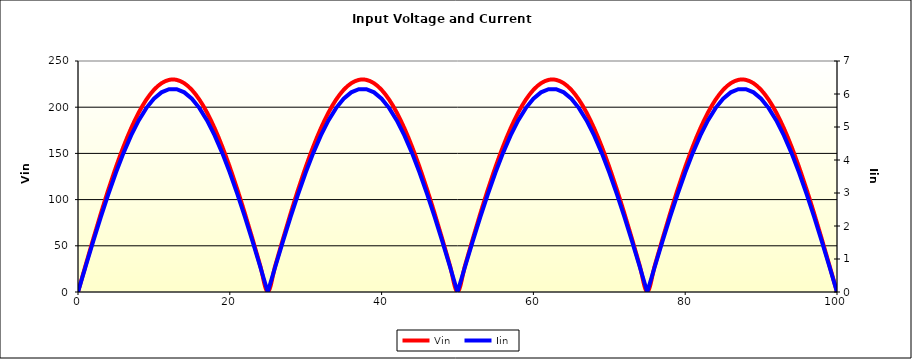
| Category | Vin |
|---|---|
| 0.0 | 0 |
| 0.1 | 2.89 |
| 0.2 | 5.78 |
| 0.3 | 8.669 |
| 0.4 | 11.556 |
| 0.5 | 14.442 |
| 0.6 | 17.325 |
| 0.7 | 20.206 |
| 0.8 | 23.083 |
| 0.9 | 25.957 |
| 1.0 | 28.827 |
| 2.0 | 57.199 |
| 3.0 | 84.669 |
| 4.0 | 110.803 |
| 5.0 | 135.191 |
| 6.0 | 157.446 |
| 7.0 | 177.218 |
| 8.0 | 194.195 |
| 9.0 | 208.11 |
| 10.0 | 218.743 |
| 11.0 | 225.926 |
| 12.0 | 229.546 |
| 13.0 | 229.546 |
| 14.0 | 225.926 |
| 15.0 | 218.743 |
| 16.0 | 208.11 |
| 17.0 | 194.195 |
| 18.0 | 177.218 |
| 19.0 | 157.446 |
| 20.0 | 135.191 |
| 21.0 | 110.803 |
| 22.0 | 84.669 |
| 23.0 | 57.199 |
| 24.0 | 28.827 |
| 25.0 | 0 |
| 26.0 | 28.827 |
| 27.0 | 57.199 |
| 28.0 | 84.669 |
| 29.0 | 110.803 |
| 30.0 | 135.191 |
| 31.0 | 157.446 |
| 32.0 | 177.218 |
| 33.0 | 194.195 |
| 34.0 | 208.11 |
| 35.0 | 218.743 |
| 36.0 | 225.926 |
| 37.0 | 229.546 |
| 38.0 | 229.546 |
| 39.0 | 225.926 |
| 40.0 | 218.743 |
| 41.0 | 208.11 |
| 42.0 | 194.195 |
| 43.0 | 177.218 |
| 44.0 | 157.446 |
| 45.0 | 135.191 |
| 46.0 | 110.803 |
| 47.0 | 84.669 |
| 48.0 | 57.199 |
| 49.0 | 28.827 |
| 50.0 | 0 |
| 51.0 | 28.827 |
| 52.0 | 57.199 |
| 53.0 | 84.669 |
| 54.0 | 110.803 |
| 55.0 | 135.191 |
| 56.0 | 157.446 |
| 57.0 | 177.218 |
| 58.0 | 194.195 |
| 59.0 | 208.11 |
| 60.0 | 218.743 |
| 61.0 | 225.926 |
| 62.0 | 229.546 |
| 63.0 | 229.546 |
| 64.0 | 225.926 |
| 65.0 | 218.743 |
| 66.0 | 208.11 |
| 67.0 | 194.195 |
| 68.0 | 177.218 |
| 69.0 | 157.446 |
| 70.0 | 135.191 |
| 71.0 | 110.803 |
| 72.0 | 84.669 |
| 73.0 | 57.199 |
| 74.0 | 28.827 |
| 75.0 | 0 |
| 76.0 | 28.827 |
| 77.0 | 57.199 |
| 78.0 | 84.669 |
| 79.0 | 110.803 |
| 80.0 | 135.191 |
| 81.0 | 157.446 |
| 82.0 | 177.218 |
| 83.0 | 194.195 |
| 84.0 | 208.11 |
| 85.0 | 218.743 |
| 86.0 | 225.926 |
| 87.0 | 229.546 |
| 88.0 | 229.546 |
| 89.0 | 225.926 |
| 90.0 | 218.743 |
| 91.0 | 208.11 |
| 92.0 | 194.195 |
| 93.0 | 177.218 |
| 94.0 | 157.446 |
| 95.0 | 135.191 |
| 96.0 | 110.803 |
| 97.0 | 84.669 |
| 98.0 | 57.199 |
| 99.0 | 28.827 |
| 100.0 | 0 |